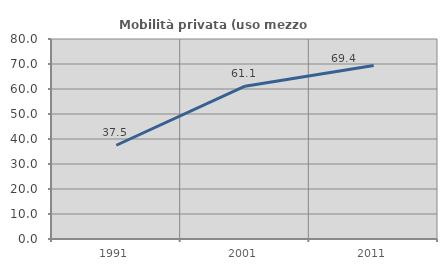
| Category | Mobilità privata (uso mezzo privato) |
|---|---|
| 1991.0 | 37.5 |
| 2001.0 | 61.111 |
| 2011.0 | 69.412 |